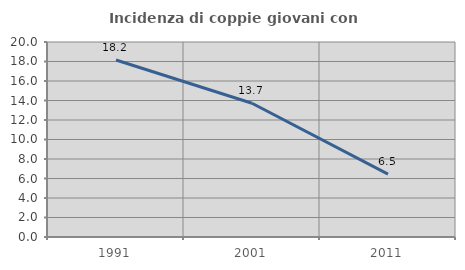
| Category | Incidenza di coppie giovani con figli |
|---|---|
| 1991.0 | 18.158 |
| 2001.0 | 13.72 |
| 2011.0 | 6.452 |